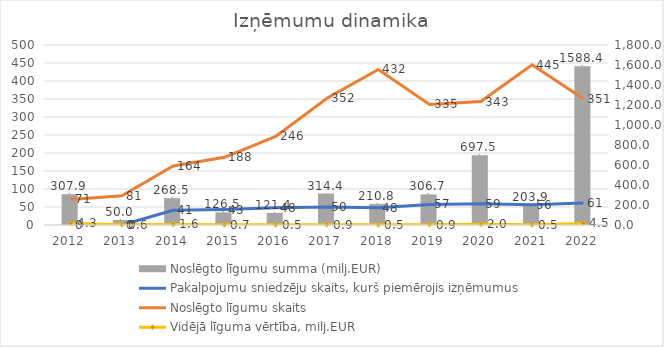
| Category | Noslēgto līgumu summa (milj.EUR) |
|---|---|
| 2012.0 | 307.912 |
| 2013.0 | 50.012 |
| 2014.0 | 268.503 |
| 2015.0 | 126.516 |
| 2016.0 | 121.4 |
| 2017.0 | 314.424 |
| 2018.0 | 210.8 |
| 2019.0 | 306.7 |
| 2020.0 | 697.5 |
| 2021.0 | 203.9 |
| 2022.0 | 1588.4 |